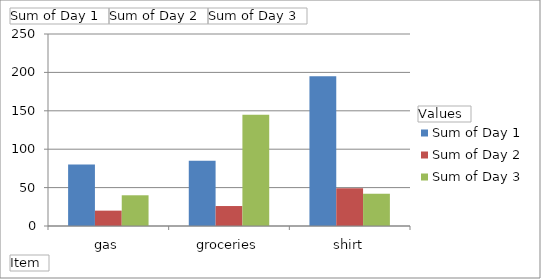
| Category | Sum of Day 1 | Sum of Day 2 | Sum of Day 3 |
|---|---|---|---|
| gas | 80 | 20 | 40 |
| groceries | 85 | 26 | 145 |
| shirt | 195 | 49 | 42 |